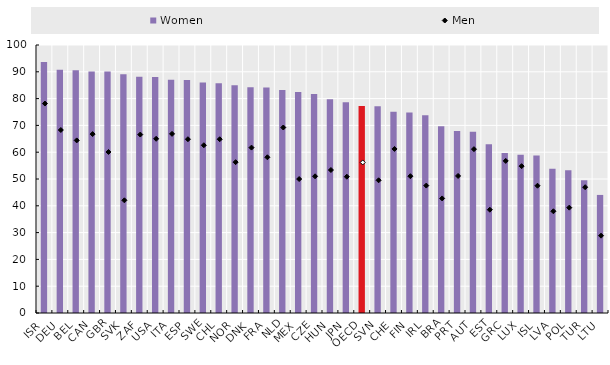
| Category | Women |
|---|---|
| ISR | 93.7 |
| DEU | 90.721 |
| BEL | 90.57 |
| CAN | 90.087 |
| GBR | 90.072 |
| SVK | 89.102 |
| ZAF | 88.179 |
| USA | 88.021 |
| ITA | 87.019 |
| ESP | 86.91 |
| SWE | 85.987 |
| CHL | 85.739 |
| NOR | 84.95 |
| DNK | 84.252 |
| FRA | 84.164 |
| NLD | 83.233 |
| MEX | 82.493 |
| CZE | 81.677 |
| HUN | 79.717 |
| JPN | 78.676 |
| OECD | 77.201 |
| SVN | 77.17 |
| CHE | 75.065 |
| FIN | 74.789 |
| IRL | 73.768 |
| BRA | 69.645 |
| PRT | 67.882 |
| AUT | 67.612 |
| EST | 62.944 |
| GRC | 59.661 |
| LUX | 59.091 |
| ISL | 58.73 |
| LVA | 53.827 |
| POL | 53.278 |
| TUR | 49.522 |
| LTU | 44.059 |